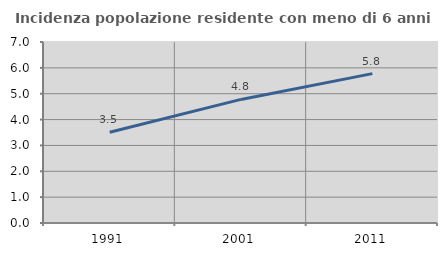
| Category | Incidenza popolazione residente con meno di 6 anni |
|---|---|
| 1991.0 | 3.512 |
| 2001.0 | 4.779 |
| 2011.0 | 5.776 |